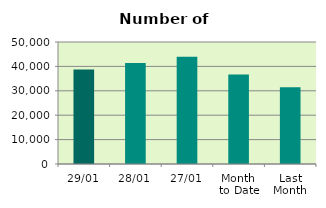
| Category | Series 0 |
|---|---|
| 29/01 | 38766 |
| 28/01 | 41386 |
| 27/01 | 43936 |
| Month 
to Date | 36693.2 |
| Last
Month | 31497.9 |